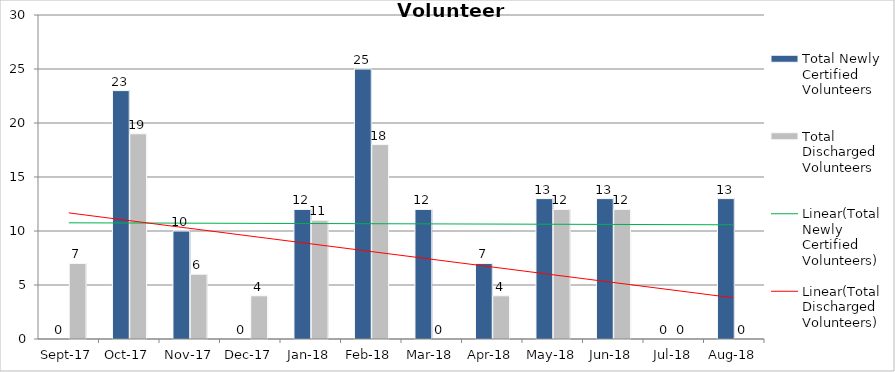
| Category | Total Newly Certified Volunteers | Total Discharged Volunteers |
|---|---|---|
| 2017-09-01 | 0 | 7 |
| 2017-10-01 | 23 | 19 |
| 2017-11-01 | 10 | 6 |
| 2017-12-01 | 0 | 4 |
| 2018-01-01 | 12 | 11 |
| 2018-02-01 | 25 | 18 |
| 2018-03-01 | 12 | 0 |
| 2018-04-01 | 7 | 4 |
| 2018-05-01 | 13 | 12 |
| 2018-06-01 | 13 | 12 |
| 2018-07-01 | 0 | 0 |
| 2018-08-01 | 13 | 0 |